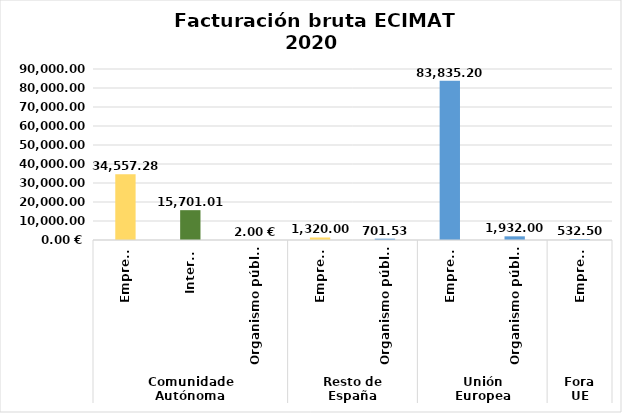
| Category | Importe bruto |
|---|---|
| 0 | 34557.281 |
| 1 | 15701.01 |
| 2 | 2 |
| 3 | 1320 |
| 4 | 701.529 |
| 5 | 83835.2 |
| 6 | 1932 |
| 7 | 532.5 |